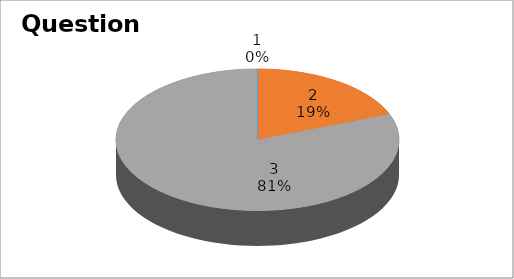
| Category | Series 0 |
|---|---|
| 0 | 0 |
| 1 | 4 |
| 2 | 17 |